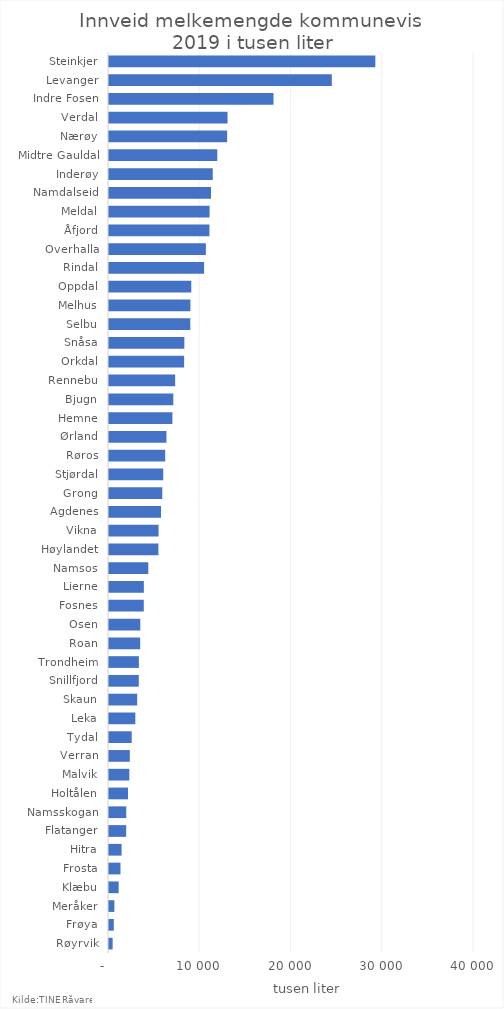
| Category | Totalt |
|---|---|
| Røyrvik | 398.339 |
| Frøya | 525.894 |
| Meråker | 588.736 |
| Klæbu | 1059.528 |
| Frosta | 1257.684 |
| Hitra | 1378.379 |
| Flatanger | 1883.184 |
| Namsskogan | 1890.678 |
| Holtålen | 2085.199 |
| Malvik | 2227.048 |
| Verran | 2279.611 |
| Tydal | 2488.755 |
| Leka | 2884.676 |
| Skaun | 3087.858 |
| Snillfjord | 3265.616 |
| Trondheim | 3273.531 |
| Roan | 3417.442 |
| Osen | 3427.973 |
| Fosnes | 3813.202 |
| Lierne | 3819.496 |
| Namsos | 4307.313 |
| Høylandet | 5412.44 |
| Vikna | 5433.683 |
| Agdenes | 5703.422 |
| Grong | 5838.908 |
| Stjørdal | 5942.75 |
| Røros | 6159.331 |
| Ørland | 6294.818 |
| Hemne | 6950.204 |
| Bjugn | 7046.717 |
| Rennebu | 7249.27 |
| Orkdal | 8232.125 |
| Snåsa | 8257.392 |
| Selbu | 8909.246 |
| Melhus | 8923.946 |
| Oppdal | 9015.851 |
| Rindal | 10418.497 |
| Overhalla | 10618.043 |
| Åfjord | 11006.285 |
| Meldal | 11019.1 |
| Namdalseid | 11178.781 |
| Inderøy | 11370.775 |
| Midtre Gauldal | 11866.104 |
| Nærøy | 12945.092 |
| Verdal | 12989.2 |
| Indre Fosen | 18028.353 |
| Levanger | 24418.646 |
| Steinkjer | 29187.09 |